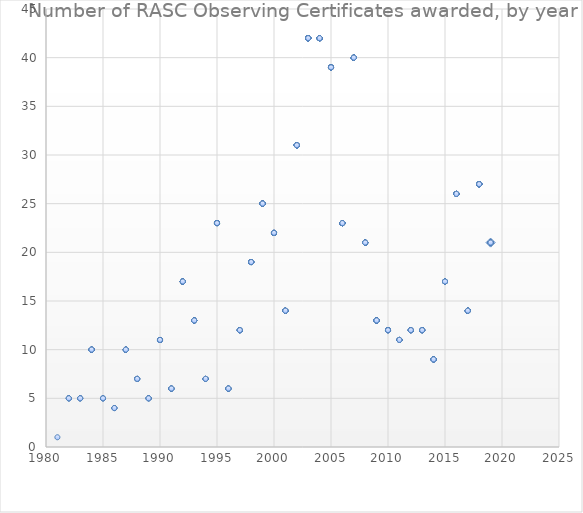
| Category | Series 0 |
|---|---|
| 2019.0 | 21 |
| 2019.0 | 21 |
| 2019.0 | 21 |
| 2019.0 | 21 |
| 2019.0 | 21 |
| 2019.0 | 21 |
| 2019.0 | 21 |
| 2019.0 | 21 |
| 2019.0 | 21 |
| 2018.0 | 27 |
| 2018.0 | 27 |
| 2018.0 | 27 |
| 2018.0 | 27 |
| 2018.0 | 27 |
| 2018.0 | 27 |
| 2018.0 | 27 |
| 2018.0 | 27 |
| 2018.0 | 27 |
| 2018.0 | 27 |
| 2018.0 | 27 |
| 2018.0 | 27 |
| 2018.0 | 27 |
| 2018.0 | 27 |
| 2018.0 | 27 |
| 2018.0 | 27 |
| 2018.0 | 27 |
| 2018.0 | 27 |
| 2018.0 | 27 |
| 2018.0 | 27 |
| 2018.0 | 27 |
| 2018.0 | 27 |
| 2018.0 | 27 |
| 2018.0 | 27 |
| 2018.0 | 27 |
| 2018.0 | 27 |
| 2018.0 | 27 |
| 2017.0 | 14 |
| 2017.0 | 14 |
| 2017.0 | 14 |
| 2017.0 | 14 |
| 2017.0 | 14 |
| 2017.0 | 14 |
| 2017.0 | 14 |
| 2017.0 | 14 |
| 2017.0 | 14 |
| 2017.0 | 14 |
| 2017.0 | 14 |
| 2017.0 | 14 |
| 2017.0 | 14 |
| 2017.0 | 14 |
| 2016.0 | 26 |
| 2016.0 | 26 |
| 2016.0 | 26 |
| 2016.0 | 26 |
| 2016.0 | 26 |
| 2016.0 | 26 |
| 2016.0 | 26 |
| 2016.0 | 26 |
| 2016.0 | 26 |
| 2016.0 | 26 |
| 2016.0 | 26 |
| 2016.0 | 26 |
| 2016.0 | 26 |
| 2016.0 | 26 |
| 2016.0 | 26 |
| 2016.0 | 26 |
| 2016.0 | 26 |
| 2016.0 | 26 |
| 2016.0 | 26 |
| 2016.0 | 26 |
| 2016.0 | 26 |
| 2016.0 | 26 |
| 2016.0 | 26 |
| 2016.0 | 26 |
| 2016.0 | 26 |
| 2016.0 | 26 |
| 2015.0 | 17 |
| 2015.0 | 17 |
| 2015.0 | 17 |
| 2015.0 | 17 |
| 2015.0 | 17 |
| 2015.0 | 17 |
| 2015.0 | 17 |
| 2015.0 | 17 |
| 2015.0 | 17 |
| 2015.0 | 17 |
| 2015.0 | 17 |
| 2015.0 | 17 |
| 2015.0 | 17 |
| 2015.0 | 17 |
| 2015.0 | 17 |
| 2015.0 | 17 |
| 2015.0 | 17 |
| 2014.0 | 9 |
| 2014.0 | 9 |
| 2014.0 | 9 |
| 2014.0 | 9 |
| 2014.0 | 9 |
| 2014.0 | 9 |
| 2014.0 | 9 |
| 2014.0 | 9 |
| 2014.0 | 9 |
| 2013.0 | 12 |
| 2013.0 | 12 |
| 2013.0 | 12 |
| 2013.0 | 12 |
| 2013.0 | 12 |
| 2013.0 | 12 |
| 2013.0 | 12 |
| 2013.0 | 12 |
| 2013.0 | 12 |
| 2013.0 | 12 |
| 2013.0 | 12 |
| 2013.0 | 12 |
| 2012.0 | 12 |
| 2012.0 | 12 |
| 2012.0 | 12 |
| 2012.0 | 12 |
| 2012.0 | 12 |
| 2012.0 | 12 |
| 2012.0 | 12 |
| 2012.0 | 12 |
| 2012.0 | 12 |
| 2012.0 | 12 |
| 2012.0 | 12 |
| 2012.0 | 12 |
| 2011.0 | 11 |
| 2011.0 | 11 |
| 2011.0 | 11 |
| 2011.0 | 11 |
| 2011.0 | 11 |
| 2011.0 | 11 |
| 2011.0 | 11 |
| 2011.0 | 11 |
| 2011.0 | 11 |
| 2011.0 | 11 |
| 2011.0 | 11 |
| 2010.0 | 12 |
| 2010.0 | 12 |
| 2010.0 | 12 |
| 2010.0 | 12 |
| 2010.0 | 12 |
| 2010.0 | 12 |
| 2010.0 | 12 |
| 2010.0 | 12 |
| 2010.0 | 12 |
| 2010.0 | 12 |
| 2010.0 | 12 |
| 2010.0 | 12 |
| 2009.0 | 13 |
| 2009.0 | 13 |
| 2009.0 | 13 |
| 2009.0 | 13 |
| 2009.0 | 13 |
| 2009.0 | 13 |
| 2009.0 | 13 |
| 2009.0 | 13 |
| 2009.0 | 13 |
| 2009.0 | 13 |
| 2009.0 | 13 |
| 2009.0 | 13 |
| 2009.0 | 13 |
| 2008.0 | 21 |
| 2008.0 | 21 |
| 2008.0 | 21 |
| 2008.0 | 21 |
| 2008.0 | 21 |
| 2008.0 | 21 |
| 2008.0 | 21 |
| 2008.0 | 21 |
| 2008.0 | 21 |
| 2008.0 | 21 |
| 2008.0 | 21 |
| 2008.0 | 21 |
| 2008.0 | 21 |
| 2008.0 | 21 |
| 2008.0 | 21 |
| 2008.0 | 21 |
| 2008.0 | 21 |
| 2008.0 | 21 |
| 2008.0 | 21 |
| 2008.0 | 21 |
| 2008.0 | 21 |
| 2007.0 | 40 |
| 2007.0 | 40 |
| 2007.0 | 40 |
| 2007.0 | 40 |
| 2007.0 | 40 |
| 2007.0 | 40 |
| 2007.0 | 40 |
| 2007.0 | 40 |
| 2007.0 | 40 |
| 2007.0 | 40 |
| 2007.0 | 40 |
| 2007.0 | 40 |
| 2007.0 | 40 |
| 2007.0 | 40 |
| 2007.0 | 40 |
| 2007.0 | 40 |
| 2007.0 | 40 |
| 2007.0 | 40 |
| 2007.0 | 40 |
| 2007.0 | 40 |
| 2007.0 | 40 |
| 2007.0 | 40 |
| 2007.0 | 40 |
| 2007.0 | 40 |
| 2007.0 | 40 |
| 2007.0 | 40 |
| 2007.0 | 40 |
| 2007.0 | 40 |
| 2007.0 | 40 |
| 2007.0 | 40 |
| 2007.0 | 40 |
| 2007.0 | 40 |
| 2007.0 | 40 |
| 2007.0 | 40 |
| 2007.0 | 40 |
| 2007.0 | 40 |
| 2007.0 | 40 |
| 2007.0 | 40 |
| 2007.0 | 40 |
| 2007.0 | 40 |
| 2006.0 | 23 |
| 2006.0 | 23 |
| 2006.0 | 23 |
| 2006.0 | 23 |
| 2006.0 | 23 |
| 2006.0 | 23 |
| 2006.0 | 23 |
| 2006.0 | 23 |
| 2006.0 | 23 |
| 2006.0 | 23 |
| 2006.0 | 23 |
| 2006.0 | 23 |
| 2006.0 | 23 |
| 2006.0 | 23 |
| 2006.0 | 23 |
| 2006.0 | 23 |
| 2006.0 | 23 |
| 2006.0 | 23 |
| 2006.0 | 23 |
| 2006.0 | 23 |
| 2006.0 | 23 |
| 2006.0 | 23 |
| 2006.0 | 23 |
| 2005.0 | 39 |
| 2005.0 | 39 |
| 2005.0 | 39 |
| 2005.0 | 39 |
| 2005.0 | 39 |
| 2005.0 | 39 |
| 2005.0 | 39 |
| 2005.0 | 39 |
| 2005.0 | 39 |
| 2005.0 | 39 |
| 2005.0 | 39 |
| 2005.0 | 39 |
| 2005.0 | 39 |
| 2005.0 | 39 |
| 2005.0 | 39 |
| 2005.0 | 39 |
| 2005.0 | 39 |
| 2005.0 | 39 |
| 2005.0 | 39 |
| 2005.0 | 39 |
| 2005.0 | 39 |
| 2005.0 | 39 |
| 2005.0 | 39 |
| 2005.0 | 39 |
| 2005.0 | 39 |
| 2005.0 | 39 |
| 2005.0 | 39 |
| 2005.0 | 39 |
| 2005.0 | 39 |
| 2005.0 | 39 |
| 2005.0 | 39 |
| 2005.0 | 39 |
| 2005.0 | 39 |
| 2005.0 | 39 |
| 2005.0 | 39 |
| 2005.0 | 39 |
| 2005.0 | 39 |
| 2005.0 | 39 |
| 2005.0 | 39 |
| 2004.0 | 42 |
| 2004.0 | 42 |
| 2004.0 | 42 |
| 2004.0 | 42 |
| 2004.0 | 42 |
| 2004.0 | 42 |
| 2004.0 | 42 |
| 2004.0 | 42 |
| 2004.0 | 42 |
| 2004.0 | 42 |
| 2004.0 | 42 |
| 2004.0 | 42 |
| 2004.0 | 42 |
| 2004.0 | 42 |
| 2004.0 | 42 |
| 2004.0 | 42 |
| 2004.0 | 42 |
| 2004.0 | 42 |
| 2004.0 | 42 |
| 2004.0 | 42 |
| 2004.0 | 42 |
| 2004.0 | 42 |
| 2004.0 | 42 |
| 2004.0 | 42 |
| 2004.0 | 42 |
| 2004.0 | 42 |
| 2004.0 | 42 |
| 2004.0 | 42 |
| 2004.0 | 42 |
| 2004.0 | 42 |
| 2004.0 | 42 |
| 2004.0 | 42 |
| 2004.0 | 42 |
| 2004.0 | 42 |
| 2004.0 | 42 |
| 2004.0 | 42 |
| 2004.0 | 42 |
| 2004.0 | 42 |
| 2004.0 | 42 |
| 2004.0 | 42 |
| 2004.0 | 42 |
| 2004.0 | 42 |
| 2003.0 | 42 |
| 2003.0 | 42 |
| 2003.0 | 42 |
| 2003.0 | 42 |
| 2003.0 | 42 |
| 2003.0 | 42 |
| 2003.0 | 42 |
| 2003.0 | 42 |
| 2003.0 | 42 |
| 2003.0 | 42 |
| 2003.0 | 42 |
| 2003.0 | 42 |
| 2003.0 | 42 |
| 2003.0 | 42 |
| 2003.0 | 42 |
| 2003.0 | 42 |
| 2003.0 | 42 |
| 2003.0 | 42 |
| 2003.0 | 42 |
| 2003.0 | 42 |
| 2003.0 | 42 |
| 2003.0 | 42 |
| 2003.0 | 42 |
| 2003.0 | 42 |
| 2003.0 | 42 |
| 2003.0 | 42 |
| 2003.0 | 42 |
| 2003.0 | 42 |
| 2003.0 | 42 |
| 2003.0 | 42 |
| 2003.0 | 42 |
| 2003.0 | 42 |
| 2003.0 | 42 |
| 2003.0 | 42 |
| 2003.0 | 42 |
| 2003.0 | 42 |
| 2003.0 | 42 |
| 2003.0 | 42 |
| 2003.0 | 42 |
| 2003.0 | 42 |
| 2003.0 | 42 |
| 2003.0 | 42 |
| 2002.0 | 31 |
| 2002.0 | 31 |
| 2002.0 | 31 |
| 2002.0 | 31 |
| 2002.0 | 31 |
| 2002.0 | 31 |
| 2002.0 | 31 |
| 2002.0 | 31 |
| 2002.0 | 31 |
| 2002.0 | 31 |
| 2002.0 | 31 |
| 2002.0 | 31 |
| 2002.0 | 31 |
| 2002.0 | 31 |
| 2002.0 | 31 |
| 2002.0 | 31 |
| 2002.0 | 31 |
| 2002.0 | 31 |
| 2002.0 | 31 |
| 2002.0 | 31 |
| 2002.0 | 31 |
| 2002.0 | 31 |
| 2002.0 | 31 |
| 2002.0 | 31 |
| 2002.0 | 31 |
| 2002.0 | 31 |
| 2002.0 | 31 |
| 2002.0 | 31 |
| 2002.0 | 31 |
| 2002.0 | 31 |
| 2002.0 | 31 |
| 2001.0 | 14 |
| 2001.0 | 14 |
| 2001.0 | 14 |
| 2001.0 | 14 |
| 2001.0 | 14 |
| 2001.0 | 14 |
| 2001.0 | 14 |
| 2001.0 | 14 |
| 2001.0 | 14 |
| 2001.0 | 14 |
| 2001.0 | 14 |
| 2001.0 | 14 |
| 2001.0 | 14 |
| 2001.0 | 14 |
| 2000.0 | 22 |
| 2000.0 | 22 |
| 2000.0 | 22 |
| 2000.0 | 22 |
| 2000.0 | 22 |
| 2000.0 | 22 |
| 2000.0 | 22 |
| 2000.0 | 22 |
| 2000.0 | 22 |
| 2000.0 | 22 |
| 2000.0 | 22 |
| 2000.0 | 22 |
| 2000.0 | 22 |
| 2000.0 | 22 |
| 2000.0 | 22 |
| 2000.0 | 22 |
| 2000.0 | 22 |
| 2000.0 | 22 |
| 2000.0 | 22 |
| 2000.0 | 22 |
| 2000.0 | 22 |
| 2000.0 | 22 |
| 1999.0 | 25 |
| 1999.0 | 25 |
| 1999.0 | 25 |
| 1999.0 | 25 |
| 1999.0 | 25 |
| 1999.0 | 25 |
| 1999.0 | 25 |
| 1999.0 | 25 |
| 1999.0 | 25 |
| 1999.0 | 25 |
| 1999.0 | 25 |
| 1999.0 | 25 |
| 1999.0 | 25 |
| 1999.0 | 25 |
| 1999.0 | 25 |
| 1999.0 | 25 |
| 1999.0 | 25 |
| 1999.0 | 25 |
| 1999.0 | 25 |
| 1999.0 | 25 |
| 1999.0 | 25 |
| 1999.0 | 25 |
| 1999.0 | 25 |
| 1999.0 | 25 |
| 1999.0 | 25 |
| 1998.0 | 19 |
| 1998.0 | 19 |
| 1998.0 | 19 |
| 1998.0 | 19 |
| 1998.0 | 19 |
| 1998.0 | 19 |
| 1998.0 | 19 |
| 1998.0 | 19 |
| 1998.0 | 19 |
| 1998.0 | 19 |
| 1998.0 | 19 |
| 1998.0 | 19 |
| 1998.0 | 19 |
| 1998.0 | 19 |
| 1998.0 | 19 |
| 1998.0 | 19 |
| 1998.0 | 19 |
| 1998.0 | 19 |
| 1998.0 | 19 |
| 1997.0 | 12 |
| 1997.0 | 12 |
| 1997.0 | 12 |
| 1997.0 | 12 |
| 1997.0 | 12 |
| 1997.0 | 12 |
| 1997.0 | 12 |
| 1997.0 | 12 |
| 1997.0 | 12 |
| 1997.0 | 12 |
| 1997.0 | 12 |
| 1997.0 | 12 |
| 1996.0 | 6 |
| 1996.0 | 6 |
| 1996.0 | 6 |
| 1996.0 | 6 |
| 1996.0 | 6 |
| 1996.0 | 6 |
| 1995.0 | 23 |
| 1995.0 | 23 |
| 1995.0 | 23 |
| 1995.0 | 23 |
| 1995.0 | 23 |
| 1995.0 | 23 |
| 1995.0 | 23 |
| 1995.0 | 23 |
| 1995.0 | 23 |
| 1995.0 | 23 |
| 1995.0 | 23 |
| 1995.0 | 23 |
| 1995.0 | 23 |
| 1995.0 | 23 |
| 1995.0 | 23 |
| 1995.0 | 23 |
| 1995.0 | 23 |
| 1995.0 | 23 |
| 1995.0 | 23 |
| 1995.0 | 23 |
| 1995.0 | 23 |
| 1995.0 | 23 |
| 1995.0 | 23 |
| 1994.0 | 7 |
| 1994.0 | 7 |
| 1994.0 | 7 |
| 1994.0 | 7 |
| 1994.0 | 7 |
| 1994.0 | 7 |
| 1994.0 | 7 |
| 1993.0 | 13 |
| 1993.0 | 13 |
| 1993.0 | 13 |
| 1993.0 | 13 |
| 1993.0 | 13 |
| 1993.0 | 13 |
| 1993.0 | 13 |
| 1993.0 | 13 |
| 1993.0 | 13 |
| 1993.0 | 13 |
| 1993.0 | 13 |
| 1993.0 | 13 |
| 1993.0 | 13 |
| 1992.0 | 17 |
| 1992.0 | 17 |
| 1992.0 | 17 |
| 1992.0 | 17 |
| 1992.0 | 17 |
| 1992.0 | 17 |
| 1992.0 | 17 |
| 1992.0 | 17 |
| 1992.0 | 17 |
| 1992.0 | 17 |
| 1992.0 | 17 |
| 1992.0 | 17 |
| 1992.0 | 17 |
| 1992.0 | 17 |
| 1992.0 | 17 |
| 1992.0 | 17 |
| 1992.0 | 17 |
| 1991.0 | 6 |
| 1991.0 | 6 |
| 1991.0 | 6 |
| 1991.0 | 6 |
| 1991.0 | 6 |
| 1991.0 | 6 |
| 1990.0 | 11 |
| 1990.0 | 11 |
| 1990.0 | 11 |
| 1990.0 | 11 |
| 1990.0 | 11 |
| 1990.0 | 11 |
| 1990.0 | 11 |
| 1990.0 | 11 |
| 1990.0 | 11 |
| 1990.0 | 11 |
| 1990.0 | 11 |
| 1989.0 | 5 |
| 1989.0 | 5 |
| 1989.0 | 5 |
| 1989.0 | 5 |
| 1989.0 | 5 |
| 1988.0 | 7 |
| 1988.0 | 7 |
| 1988.0 | 7 |
| 1988.0 | 7 |
| 1988.0 | 7 |
| 1988.0 | 7 |
| 1988.0 | 7 |
| 1987.0 | 10 |
| 1987.0 | 10 |
| 1987.0 | 10 |
| 1987.0 | 10 |
| 1987.0 | 10 |
| 1987.0 | 10 |
| 1987.0 | 10 |
| 1987.0 | 10 |
| 1987.0 | 10 |
| 1987.0 | 10 |
| 1986.0 | 4 |
| 1986.0 | 4 |
| 1986.0 | 4 |
| 1986.0 | 4 |
| 1985.0 | 5 |
| 1985.0 | 5 |
| 1985.0 | 5 |
| 1985.0 | 5 |
| 1985.0 | 5 |
| 1984.0 | 10 |
| 1984.0 | 10 |
| 1984.0 | 10 |
| 1984.0 | 10 |
| 1984.0 | 10 |
| 1984.0 | 10 |
| 1984.0 | 10 |
| 1984.0 | 10 |
| 1984.0 | 10 |
| 1984.0 | 10 |
| 1983.0 | 5 |
| 1983.0 | 5 |
| 1983.0 | 5 |
| 1983.0 | 5 |
| 1983.0 | 5 |
| 1982.0 | 5 |
| 1982.0 | 5 |
| 1982.0 | 5 |
| 1982.0 | 5 |
| 1982.0 | 5 |
| 1981.0 | 1 |